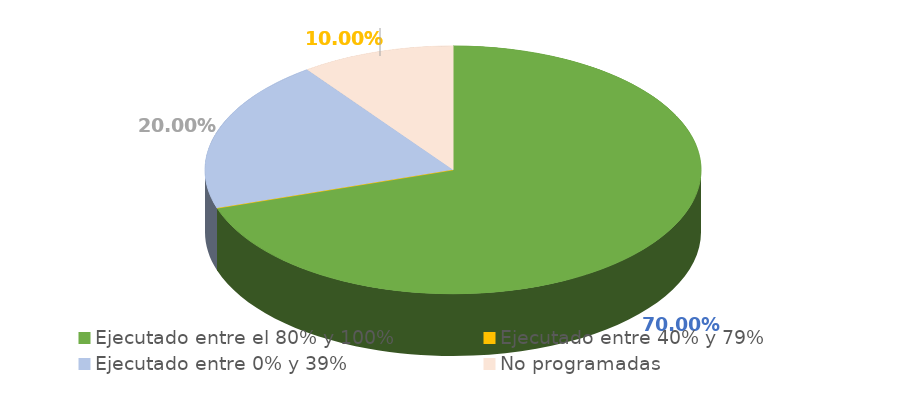
| Category | Series 0 |
|---|---|
| Ejecutado entre el 80% y 100% | 0.7 |
| Ejecutado entre 40% y 79% | 0 |
| Ejecutado entre 0% y 39% | 0.2 |
| No programadas | 0.1 |